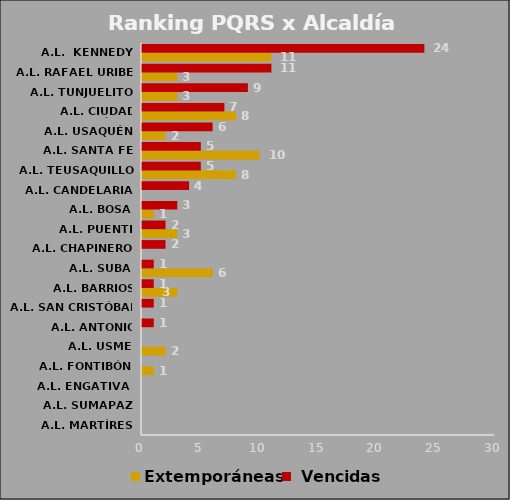
| Category | Extemporáneas |  Vencidas |
|---|---|---|
| A.L. MARTÍRES | 0 | 0 |
| A.L. SUMAPAZ | 0 | 0 |
| A.L. ENGATIVA  | 0 | 0 |
| A.L. FONTIBÓN | 1 | 0 |
| A.L. USME | 2 | 0 |
| A.L. ANTONIO NARINO | 0 | 1 |
| A.L. SAN CRISTÓBAL | 0 | 1 |
| A.L. BARRIOS UNIDOS | 3 | 1 |
| A.L. SUBA | 6 | 1 |
| A.L. CHAPINERO | 0 | 2 |
| A.L. PUENTE ARANDA | 3 | 2 |
| A.L. BOSA | 1 | 3 |
| A.L. CANDELARIA | 0 | 4 |
| A.L. TEUSAQUILLO | 8 | 5 |
| A.L. SANTA FE | 10 | 5 |
| A.L. USAQUÉN | 2 | 6 |
| A.L. CIUDAD BOLÍVAR | 8 | 7 |
| A.L. TUNJUELITO | 3 | 9 |
| A.L. RAFAEL URIBE | 3 | 11 |
| A.L.  KENNEDY | 11 | 24 |